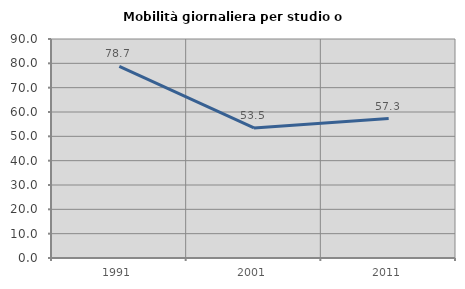
| Category | Mobilità giornaliera per studio o lavoro |
|---|---|
| 1991.0 | 78.704 |
| 2001.0 | 53.465 |
| 2011.0 | 57.303 |